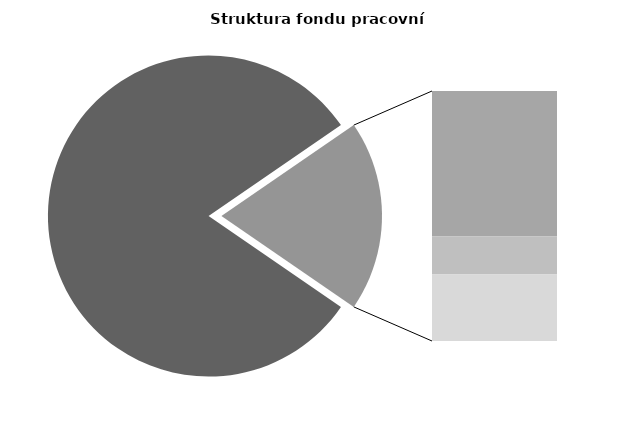
| Category | Series 0 |
|---|---|
| Průměrná měsíční odpracovaná doba bez přesčasu | 139.07 |
| Dovolená | 19.164 |
| Nemoc | 5.01 |
| Jiné | 8.776 |